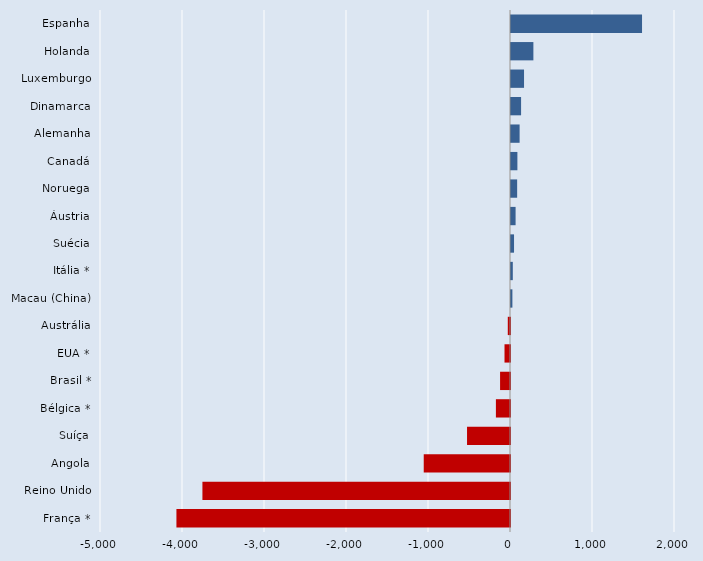
| Category | Series 0 |
|---|---|
| França * | -4068 |
| Reino Unido | -3751 |
| Angola | -1052 |
| Suíça | -524 |
| Bélgica * | -172 |
| Brasil * | -121 |
| EUA * | -67 |
| Austrália | -27 |
| Macau (China) | 17 |
| Itália * | 22 |
| Suécia | 37 |
| Áustria | 56 |
| Noruega | 75 |
| Canadá | 78 |
| Alemanha | 105 |
| Dinamarca | 123 |
| Luxemburgo | 159 |
| Holanda | 273 |
| Espanha | 1598 |